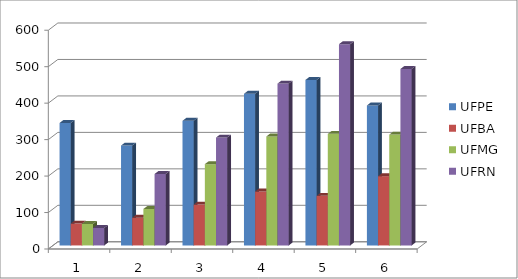
| Category | UFPE | UFBA | UFMG | UFRN |
|---|---|---|---|---|
| 0 | 336 | 60 | 59 | 48 |
| 1 | 274 | 76 | 100 | 196 |
| 2 | 342 | 112 | 223 | 296 |
| 3 | 416 | 148 | 299 | 444 |
| 4 | 454 | 136 | 306 | 552 |
| 5 | 384 | 190 | 304 | 484 |